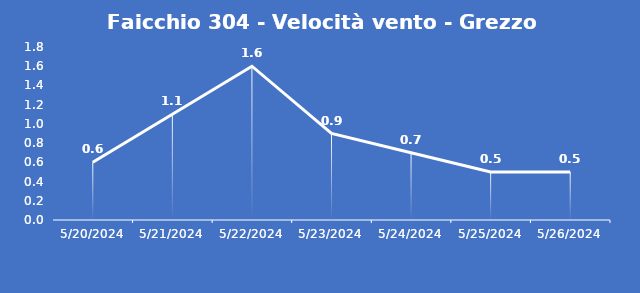
| Category | Faicchio 304 - Velocità vento - Grezzo (m/s) |
|---|---|
| 5/20/24 | 0.6 |
| 5/21/24 | 1.1 |
| 5/22/24 | 1.6 |
| 5/23/24 | 0.9 |
| 5/24/24 | 0.7 |
| 5/25/24 | 0.5 |
| 5/26/24 | 0.5 |